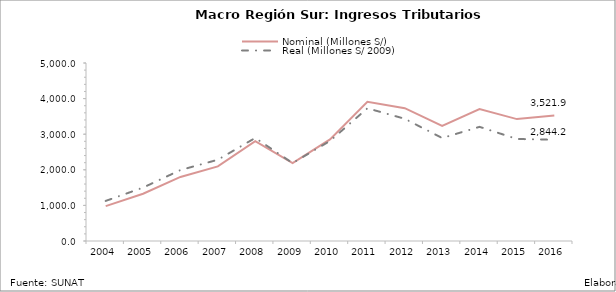
| Category | Nominal (Millones S/) | Real (Millones S/ 2009) |
|---|---|---|
| 2004.0 | 980.078 | 1126.009 |
| 2005.0 | 1326.66 | 1499.967 |
| 2006.0 | 1799.039 | 1993.166 |
| 2007.0 | 2097.164 | 2282.497 |
| 2008.0 | 2805.389 | 2894.596 |
| 2009.0 | 2190.401 | 2189.303 |
| 2010.0 | 2852.992 | 2810.572 |
| 2011.0 | 3909.139 | 3727.93 |
| 2012.0 | 3730.817 | 3433.517 |
| 2013.0 | 3232.909 | 2892.167 |
| 2014.0 | 3703.542 | 3206.841 |
| 2015.0 | 3424.342 | 2866.003 |
| 2016.0 | 3521.947 | 2844.202 |